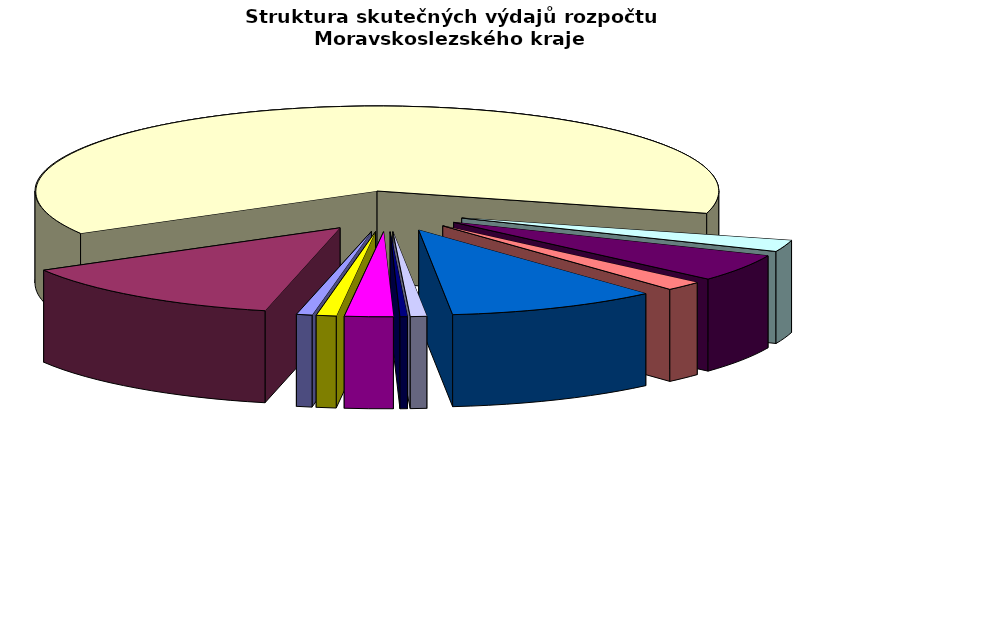
| Category | Series 0 |
|---|---|
| Regionální rozvoj | 202777.638 |
| Doprava a chytrý region | 3593030.416 |
| Školství | 17062378.578 |
| Kultura | 600387.532 |
| Zdravotnictví | 1420948.252 |
| Životní prostředí | 489877.911 |
| Sociální věci | 2722076.421 |
| Krizové řízení | 211180.379 |
| Cestovní ruch | 95463.444 |
| Všeobecná veřejná správa a služby | 625576.732 |
| Ostatní | 257145.883 |